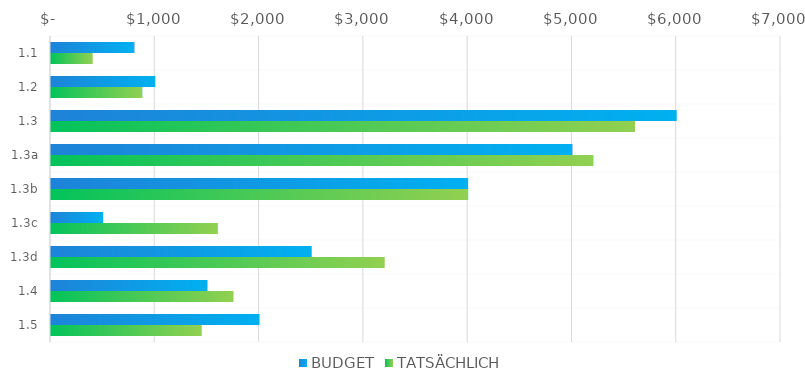
| Category | BUDGET | TATSÄCHLICH |
|---|---|---|
| 1.1 | 800 | 400 |
| 1.2 | 1000 | 875 |
| 1.3 | 6000 | 5600 |
| 1.3a | 5000 | 5200 |
| 1.3b | 4000 | 4000 |
| 1.3c | 500 | 1600 |
| 1.3d | 2500 | 3200 |
| 1.4 | 1500 | 1750 |
| 1.5 | 2000 | 1445 |